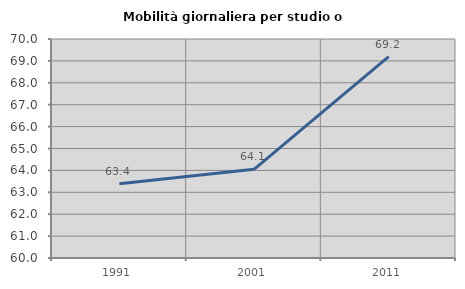
| Category | Mobilità giornaliera per studio o lavoro |
|---|---|
| 1991.0 | 63.391 |
| 2001.0 | 64.05 |
| 2011.0 | 69.193 |